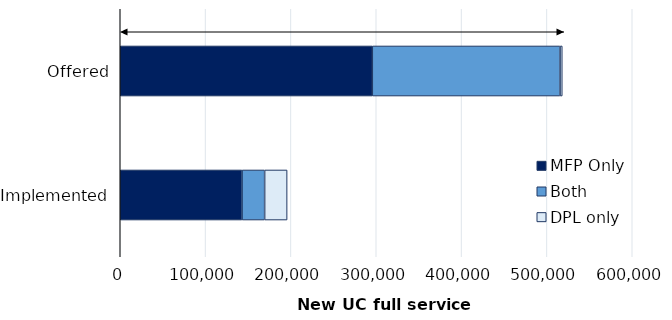
| Category | MFP Only | Both | DPL only |
|---|---|---|---|
| Offered | 295380 | 220030 | 2590 |
| Implemented | 142730 | 26480 | 26330 |